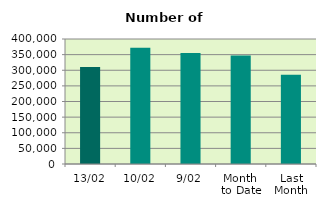
| Category | Series 0 |
|---|---|
| 13/02 | 310424 |
| 10/02 | 372286 |
| 9/02 | 355074 |
| Month 
to Date | 347055.333 |
| Last
Month | 285405.636 |